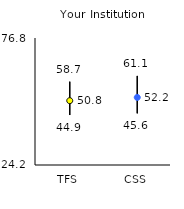
| Category | 25th | 75th | Mean |
|---|---|---|---|
| TFS | 44.9 | 58.7 | 50.84 |
| CSS | 45.6 | 61.1 | 52.19 |